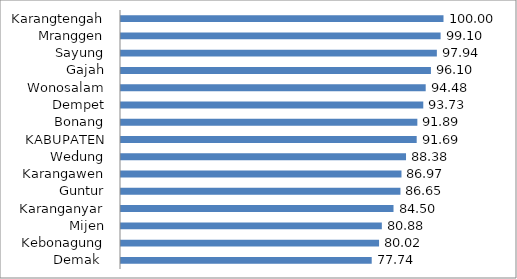
| Category | Series 0 |
|---|---|
| Demak  | 77.74 |
| Kebonagung | 80.02 |
| Mijen | 80.88 |
| Karanganyar | 84.5 |
| Guntur | 86.65 |
| Karangawen | 86.97 |
| Wedung | 88.38 |
| KABUPATEN | 91.69 |
| Bonang | 91.89 |
| Dempet | 93.73 |
| Wonosalam | 94.48 |
| Gajah | 96.1 |
| Sayung | 97.94 |
| Mranggen | 99.1 |
| Karangtengah | 100 |